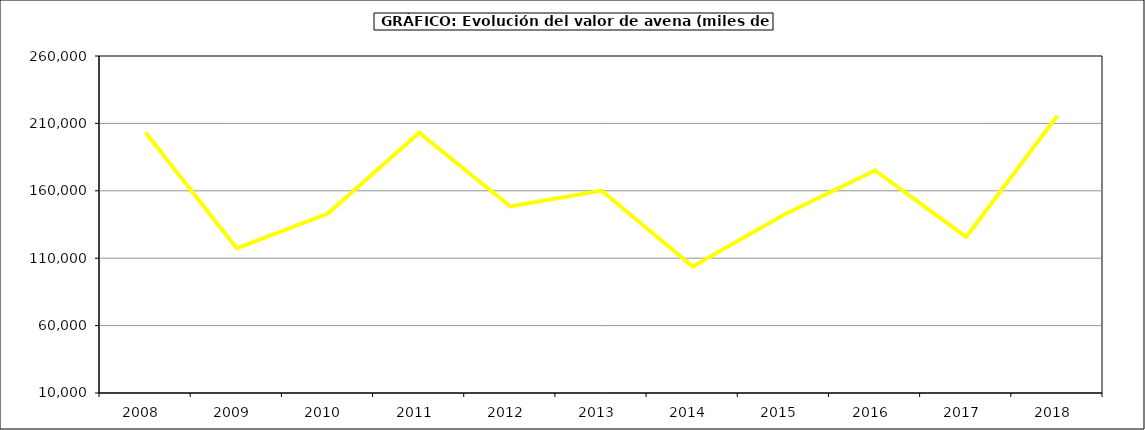
| Category | Valor |
|---|---|
| 2008.0 | 203323.263 |
| 2009.0 | 117248.747 |
| 2010.0 | 143145.142 |
| 2011.0 | 203137.341 |
| 2012.0 | 148383.942 |
| 2013.0 | 160216.853 |
| 2014.0 | 103741 |
| 2015.0 | 142229 |
| 2016.0 | 175065 |
| 2017.0 | 125814.243 |
| 2018.0 | 215756.155 |